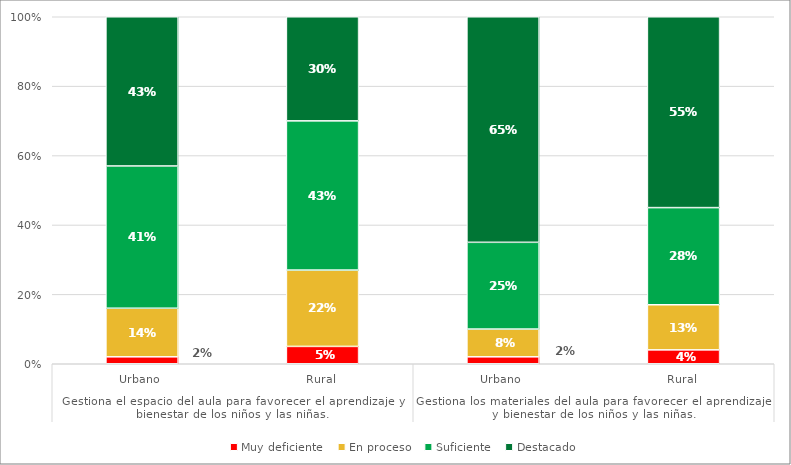
| Category | Muy deficiente | En proceso | Suficiente | Destacado |
|---|---|---|---|---|
| 0 | 0.02 | 0.14 | 0.41 | 0.43 |
| 1 | 0.05 | 0.22 | 0.43 | 0.3 |
| 2 | 0.02 | 0.08 | 0.25 | 0.65 |
| 3 | 0.04 | 0.13 | 0.28 | 0.55 |